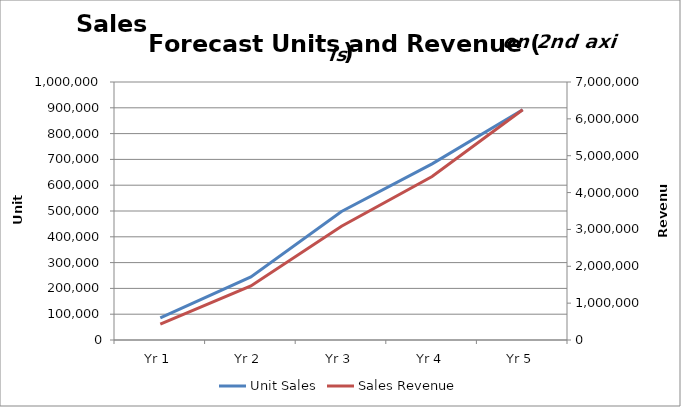
| Category | Unit Sales |
|---|---|
| Yr 1 | 86000 |
| Yr 2 | 244398.125 |
| Yr 3 | 498048.75 |
| Yr 4 | 682520.18 |
| Yr 5 | 892403.695 |